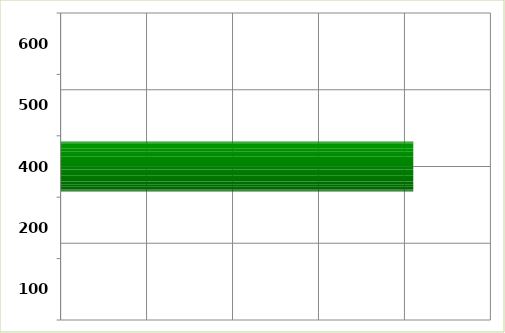
| Category | Series 0 |
|---|---|
| 100.0 | 0 |
| 200.0 | 0 |
| 400.0 | 2051347 |
| 500.0 | 0 |
| 600.0 | 0 |